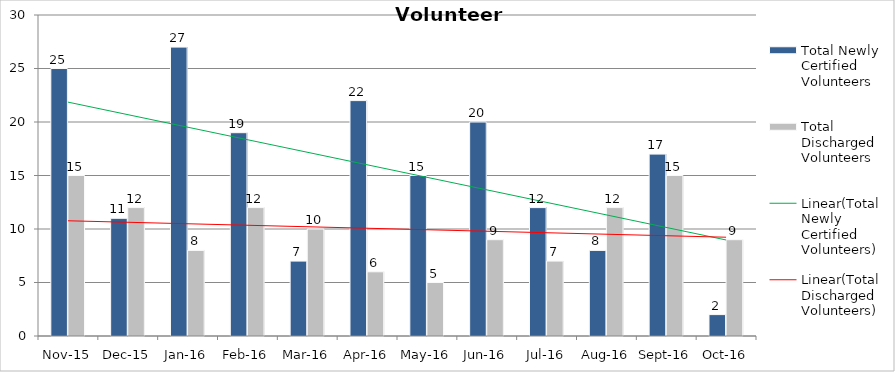
| Category | Total Newly Certified Volunteers | Total Discharged Volunteers |
|---|---|---|
| Nov-15 | 25 | 15 |
| Dec-15 | 11 | 12 |
| Jan-16 | 27 | 8 |
| Feb-16 | 19 | 12 |
| Mar-16 | 7 | 10 |
| Apr-16 | 22 | 6 |
| May-16 | 15 | 5 |
| Jun-16 | 20 | 9 |
| Jul-16 | 12 | 7 |
| Aug-16 | 8 | 12 |
| Sep-16 | 17 | 15 |
| Oct-16 | 2 | 9 |